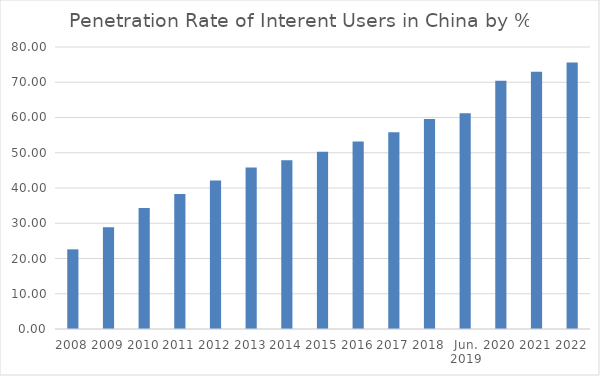
| Category | Series 0 |
|---|---|
| 2008 | 22.6 |
| 2009 | 28.9 |
| 2010 | 34.3 |
| 2011 | 38.3 |
| 2012 | 42.1 |
| 2013 | 45.8 |
| 2014 | 47.9 |
| 2015 | 50.3 |
| 2016 | 53.2 |
| 2017 | 55.8 |
| 2018 | 59.6 |
| Jun. 2019 | 61.2 |
| 2020 | 70.4 |
| 2021 | 73 |
| 2022 | 75.6 |